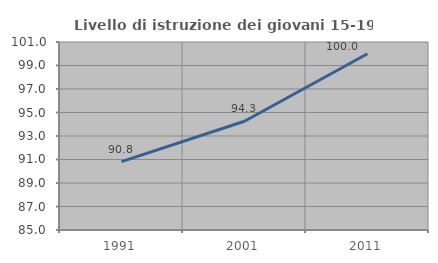
| Category | Livello di istruzione dei giovani 15-19 anni |
|---|---|
| 1991.0 | 90.816 |
| 2001.0 | 94.253 |
| 2011.0 | 100 |